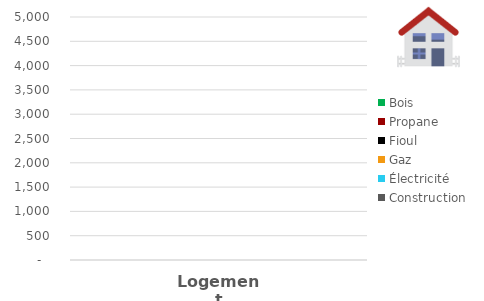
| Category | Construction | Électricité | Gaz  | Fioul | Propane | Bois  |
|---|---|---|---|---|---|---|
| 0 | 0 | 0 | 0 | 0 | 0 | 0 |